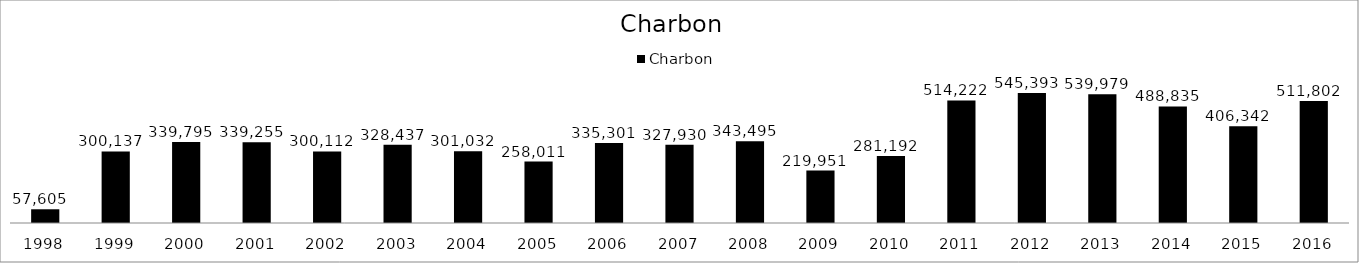
| Category |  Charbon   |
|---|---|
| 1998.0 | 57605 |
| 1999.0 | 300137 |
| 2000.0 | 339795 |
| 2001.0 | 339255 |
| 2002.0 | 300112 |
| 2003.0 | 328437 |
| 2004.0 | 301032 |
| 2005.0 | 258011 |
| 2006.0 | 335301 |
| 2007.0 | 327930 |
| 2008.0 | 343495 |
| 2009.0 | 219951 |
| 2010.0 | 281192 |
| 2011.0 | 514222 |
| 2012.0 | 545393 |
| 2013.0 | 539979 |
| 2014.0 | 488835 |
| 2015.0 | 406342 |
| 2016.0 | 511802 |